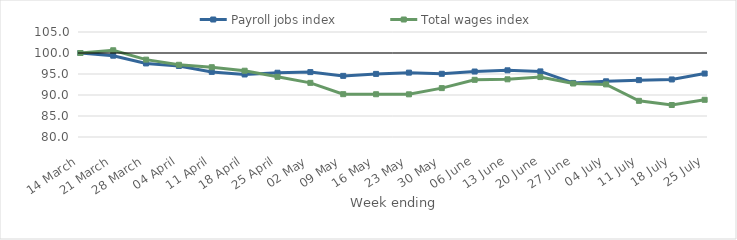
| Category | Payroll jobs index | Total wages index |
|---|---|---|
| 2020-03-14 | 100 | 100 |
| 2020-03-21 | 99.358 | 100.651 |
| 2020-03-28 | 97.516 | 98.42 |
| 2020-04-04 | 96.916 | 97.193 |
| 2020-04-11 | 95.503 | 96.617 |
| 2020-04-18 | 94.887 | 95.778 |
| 2020-04-25 | 95.298 | 94.327 |
| 2020-05-02 | 95.452 | 92.892 |
| 2020-05-09 | 94.554 | 90.194 |
| 2020-05-16 | 95.024 | 90.182 |
| 2020-05-23 | 95.325 | 90.163 |
| 2020-05-30 | 95.048 | 91.639 |
| 2020-06-06 | 95.589 | 93.613 |
| 2020-06-13 | 95.875 | 93.738 |
| 2020-06-20 | 95.617 | 94.268 |
| 2020-06-27 | 92.871 | 92.732 |
| 2020-07-04 | 93.261 | 92.529 |
| 2020-07-11 | 93.54 | 88.612 |
| 2020-07-18 | 93.701 | 87.618 |
| 2020-07-25 | 95.109 | 88.857 |